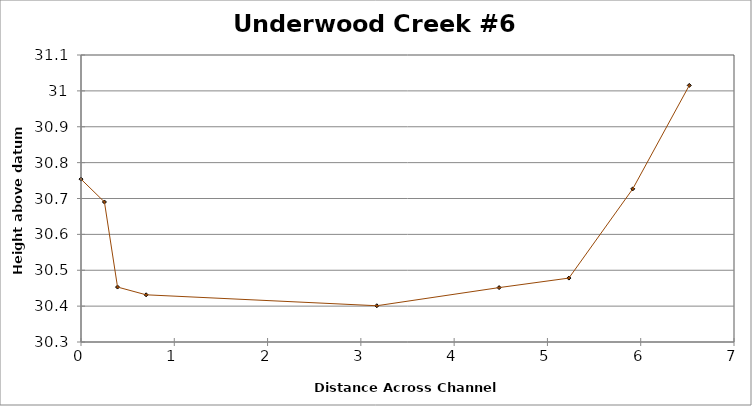
| Category | Series 0 |
|---|---|
| 0.0 | 30.754 |
| 0.25121511712455863 | 30.69 |
| 0.3916406026213048 | 30.453 |
| 0.6980099683272573 | 30.432 |
| 3.171180126840615 | 30.401 |
| 4.481994745877567 | 30.452 |
| 5.229910255983649 | 30.478 |
| 5.914793217390962 | 30.727 |
| 6.520571154995215 | 31.015 |